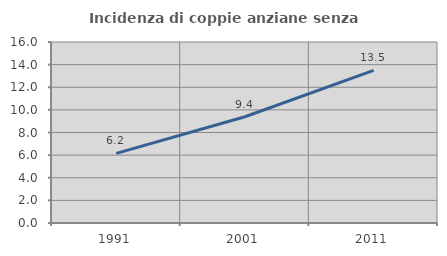
| Category | Incidenza di coppie anziane senza figli  |
|---|---|
| 1991.0 | 6.154 |
| 2001.0 | 9.39 |
| 2011.0 | 13.495 |